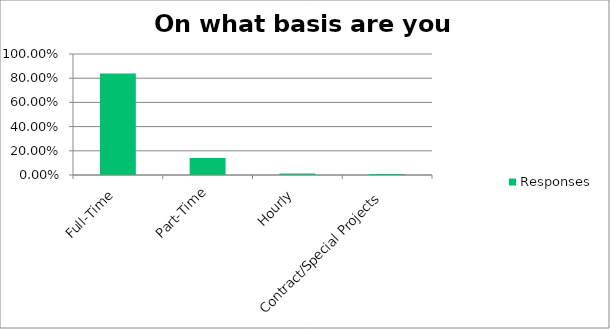
| Category | Responses |
|---|---|
| Full-Time | 0.838 |
| Part-Time | 0.141 |
| Hourly | 0.013 |
| Contract/Special Projects | 0.008 |